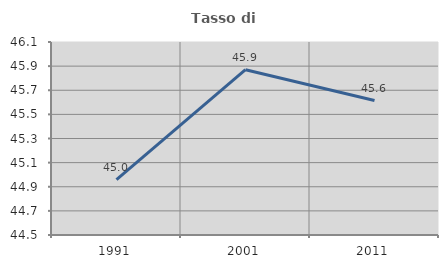
| Category | Tasso di occupazione   |
|---|---|
| 1991.0 | 44.96 |
| 2001.0 | 45.87 |
| 2011.0 | 45.615 |